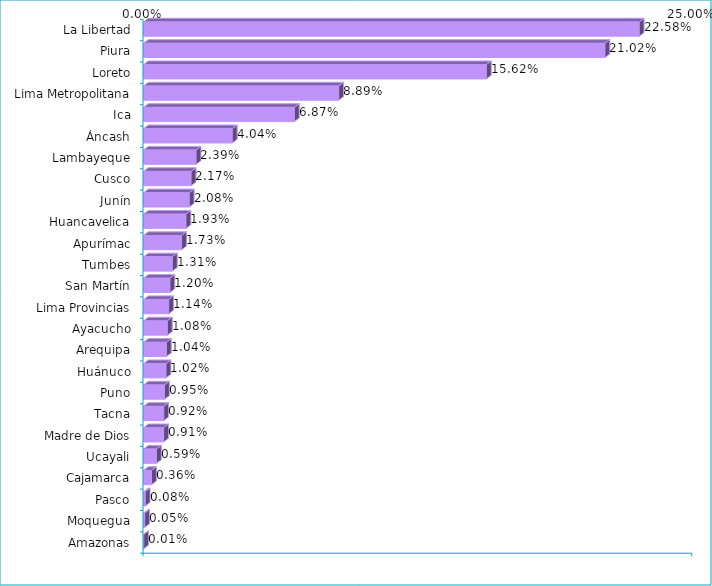
| Category | Series 0 |
|---|---|
| La Libertad | 0.226 |
| Piura | 0.21 |
| Loreto | 0.156 |
| Lima Metropolitana | 0.089 |
| Ica | 0.069 |
| Áncash | 0.04 |
| Lambayeque | 0.024 |
| Cusco | 0.022 |
| Junín | 0.021 |
| Huancavelica | 0.019 |
| Apurímac | 0.017 |
| Tumbes | 0.013 |
| San Martín | 0.012 |
| Lima Provincias | 0.011 |
| Ayacucho | 0.011 |
| Arequipa | 0.01 |
| Huánuco | 0.01 |
| Puno | 0.01 |
| Tacna | 0.009 |
| Madre de Dios | 0.009 |
| Ucayali | 0.006 |
| Cajamarca | 0.004 |
| Pasco | 0.001 |
| Moquegua | 0.001 |
| Amazonas | 0 |